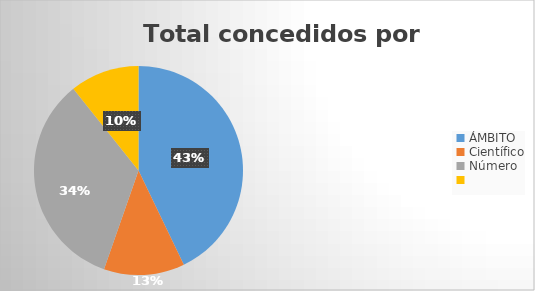
| Category | Total xeral |
|---|---|
| 0 | 48 |
| 1 | 14 |
| 2 | 38 |
| 3 | 12 |